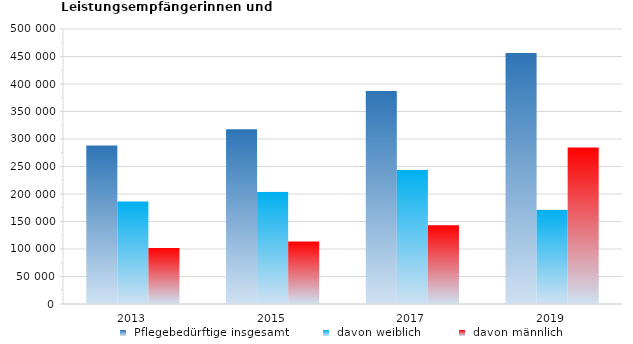
| Category |  Pflegebedürftige insgesamt |  davon weiblich |  davon männlich |
|---|---|---|---|
| 2013.0 | 288296 | 186402 | 101894 |
| 2015.0 | 317568 | 203907 | 113661 |
| 2017.0 | 387293 | 243991 | 143302 |
| 2019.0 | 456255 | 171691 | 284564 |